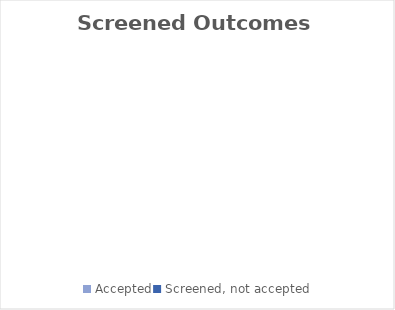
| Category | Series 0 |
|---|---|
| Accepted | 0 |
| Screened, not accepted | 0 |